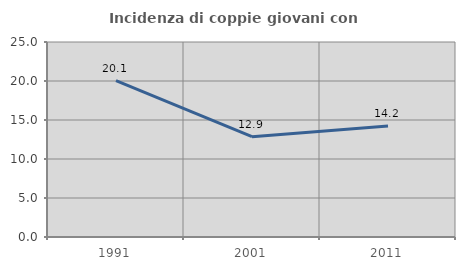
| Category | Incidenza di coppie giovani con figli |
|---|---|
| 1991.0 | 20.062 |
| 2001.0 | 12.857 |
| 2011.0 | 14.216 |